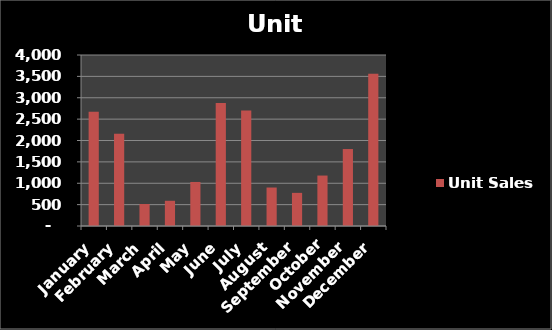
| Category | Unit Sales |
|---|---|
| January | 2670 |
| February | 2160 |
| March | 515 |
| April | 590 |
| May | 1030 |
| June | 2875 |
| July | 2700 |
| August | 900 |
| September | 775 |
| October | 1180 |
| November | 1800 |
| December | 3560 |